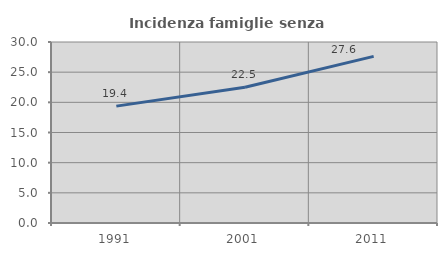
| Category | Incidenza famiglie senza nuclei |
|---|---|
| 1991.0 | 19.369 |
| 2001.0 | 22.496 |
| 2011.0 | 27.612 |